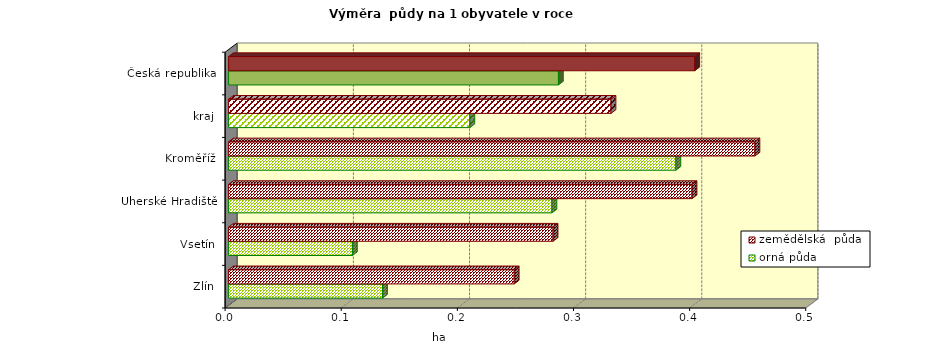
| Category | orná půda | zemědělská  půda |
|---|---|---|
| Zlín | 0.133 | 0.246 |
| Vsetín | 0.107 | 0.279 |
| Uherské Hradiště | 0.278 | 0.399 |
| Kroměříž | 0.385 | 0.453 |
| kraj | 0.208 | 0.329 |
| Česká republika | 0.284 | 0.401 |